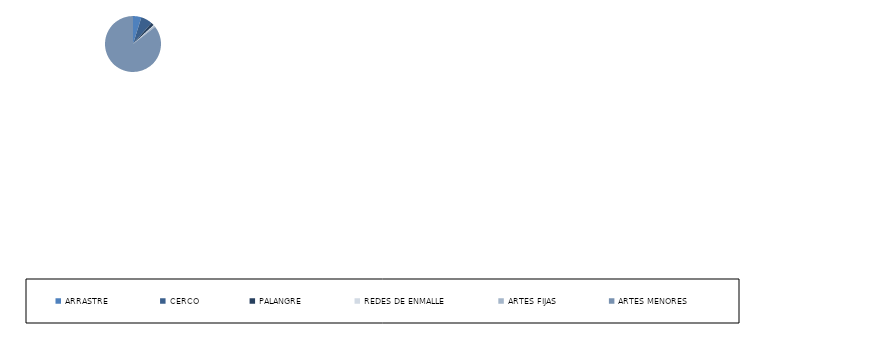
| Category | Series 0 |
|---|---|
| ARRASTRE | 11 |
| CERCO | 15 |
| PALANGRE | 4 |
| REDES DE ENMALLE | 1 |
| ARTES FIJAS | 2 |
| ARTES MENORES | 194 |